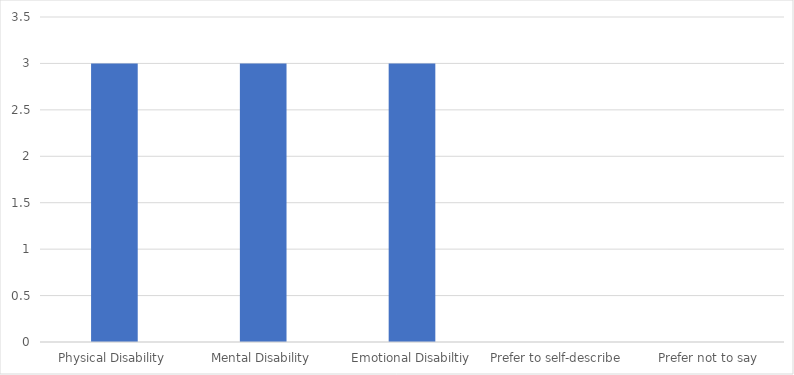
| Category | Number of Responses |
|---|---|
| Physical Disability | 3 |
| Mental Disability | 3 |
| Emotional Disabiltiy | 3 |
| Prefer to self-describe  | 0 |
| Prefer not to say | 0 |